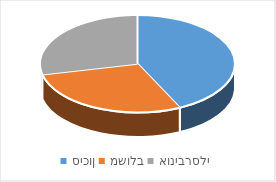
| Category | Series 0 |
|---|---|
| סיכון | 6 |
| משולב | 4 |
| אוניברסלי | 4 |